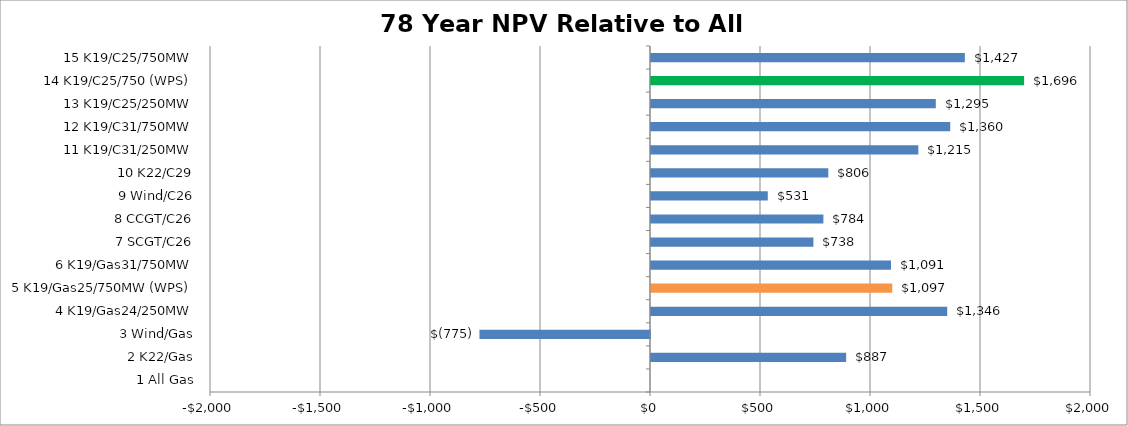
| Category | Series 0 |
|---|---|
| 1 All Gas | 0 |
| 2 K22/Gas | 887.022 |
| 3 Wind/Gas | -775.263 |
| 4 K19/Gas24/250MW | 1346.49 |
| 5 K19/Gas25/750MW (WPS) | 1096.585 |
| 6 K19/Gas31/750MW | 1090.843 |
| 7 SCGT/C26 | 738.254 |
| 8 CCGT/C26 | 783.616 |
| 9 Wind/C26 | 530.853 |
| 10 K22/C29 | 805.92 |
| 11 K19/C31/250MW | 1215.107 |
| 12 K19/C31/750MW | 1360.108 |
| 13 K19/C25/250MW | 1294.53 |
| 14 K19/C25/750 (WPS) | 1696.013 |
| 15 K19/C25/750MW | 1426.618 |